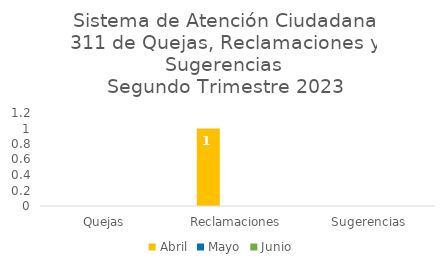
| Category | Abril | Mayo | Junio |
|---|---|---|---|
| Quejas | 0 | 0 | 0 |
| Reclamaciones | 1 | 0 | 0 |
| Sugerencias | 0 | 0 | 0 |